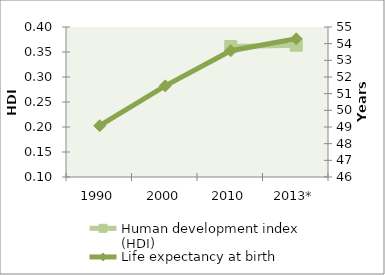
| Category | Human development index (HDI) |
|---|---|
| 1990 | 0 |
| 2000 | 0 |
| 2010 | 0.361 |
| 2013* | 0.364 |